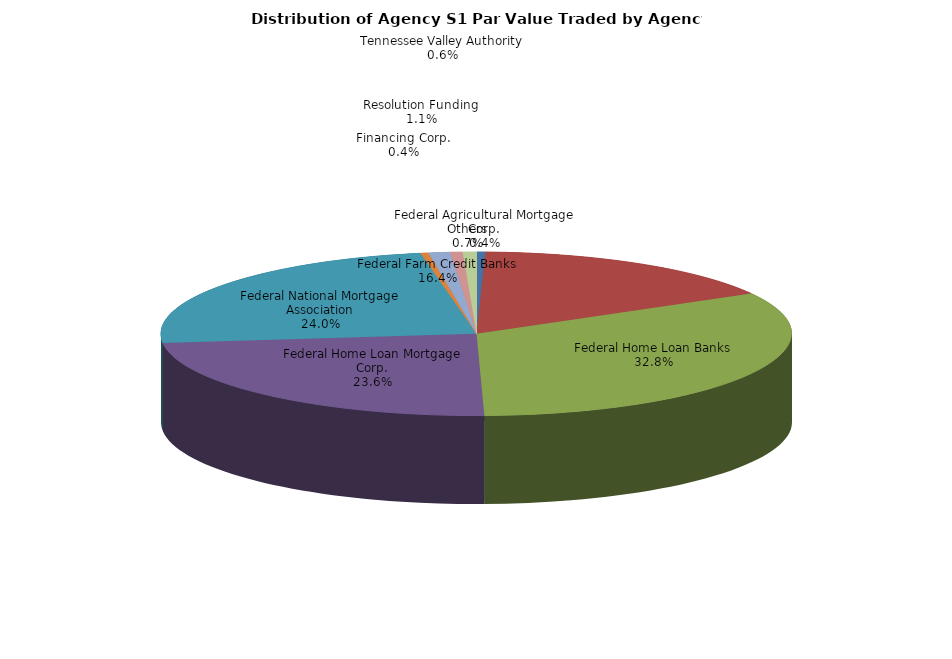
| Category | Series 0 |
|---|---|
| Federal Agricultural Mortgage Corp. | 23471948.413 |
| Federal Farm Credit Banks | 858282656.746 |
| Federal Home Loan Banks | 1722153577.082 |
| Federal Home Loan Mortgage Corp. | 1238642027.972 |
| Federal National Mortgage Association | 1257339443.294 |
| Financing Corp. | 21578486.111 |
| Resolution Funding | 57998382.937 |
| Tennessee Valley Authority | 32928255.805 |
| Others | 36746919.306 |